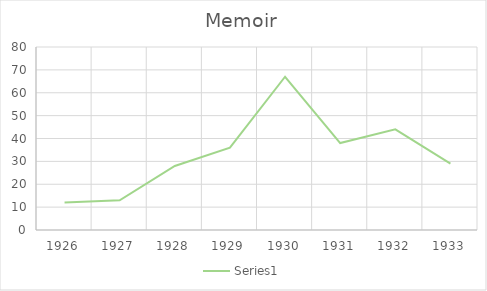
| Category | Series 0 |
|---|---|
| 1926.0 | 12 |
| 1927.0 | 13 |
| 1928.0 | 28 |
| 1929.0 | 36 |
| 1930.0 | 67 |
| 1931.0 | 38 |
| 1932.0 | 44 |
| 1933.0 | 29 |